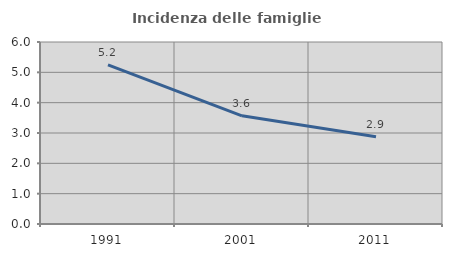
| Category | Incidenza delle famiglie numerose |
|---|---|
| 1991.0 | 5.246 |
| 2001.0 | 3.566 |
| 2011.0 | 2.874 |